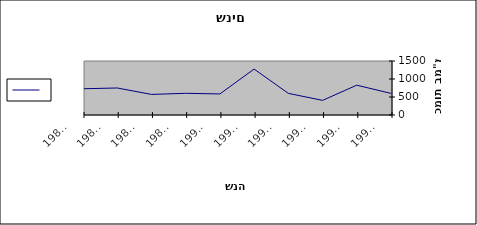
| Category | Series 0 |
|---|---|
| 1995-6 | 600 |
| 1994-5 | 828 |
| 1993-4 | 406.5 |
| 1992-3 | 601 |
| 1991-2 | 1276 |
| 1990-1 | 585 |
| 1989-90 | 602.5 |
| 1988-9 | 572 |
| 1987-8 | 750.5 |
| 1986-7 | 729 |